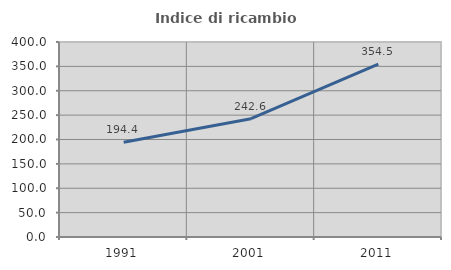
| Category | Indice di ricambio occupazionale  |
|---|---|
| 1991.0 | 194.444 |
| 2001.0 | 242.574 |
| 2011.0 | 354.545 |